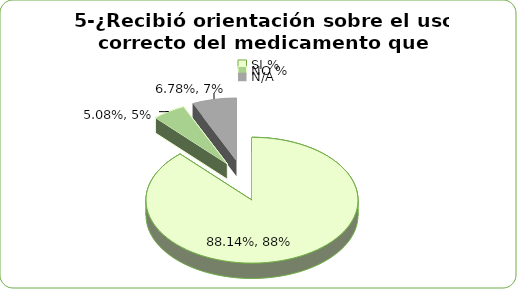
| Category | Series 0 |
|---|---|
| SI % | 0.881 |
| NO % | 0.051 |
| N/A | 0.068 |